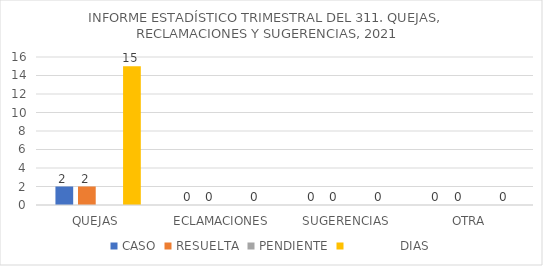
| Category | CASO | RESUELTA | PENDIENTE |              DIAS |
|---|---|---|---|---|
| QUEJAS  | 2 | 2 | 0 | 15 |
| ECLAMACIONES | 0 | 0 | 0 | 0 |
| SUGERENCIAS | 0 | 0 | 0 | 0 |
| OTRA | 0 | 0 | 0 | 0 |